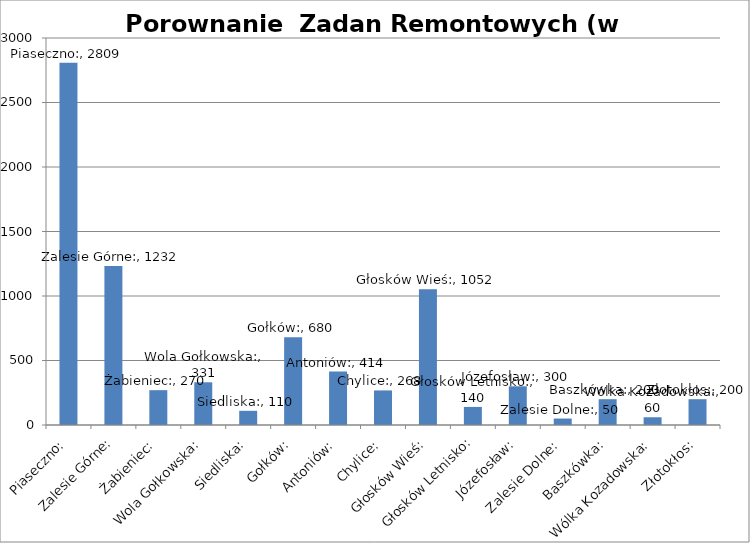
| Category | Series 0 |
|---|---|
| Piaseczno: | 2809 |
| Zalesie Górne: | 1232 |
| Żabieniec: | 270 |
| Wola Gołkowska: | 331 |
| Siedliska: | 110 |
| Gołków: | 680 |
| Antoniów: | 414 |
| Chylice: | 268 |
| Głosków Wieś: | 1052 |
| Głosków Letnisko: | 140 |
| Józefosław: | 300 |
| Zalesie Dolne: | 50 |
| Baszkówka: | 200 |
| Wólka Kozadowska: | 60 |
| Złotokłos: | 200 |